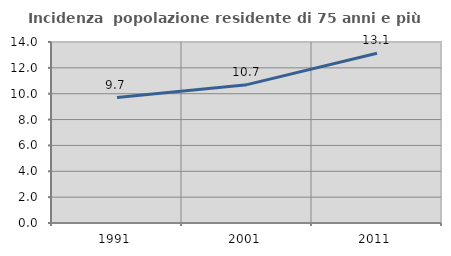
| Category | Incidenza  popolazione residente di 75 anni e più |
|---|---|
| 1991.0 | 9.704 |
| 2001.0 | 10.702 |
| 2011.0 | 13.136 |